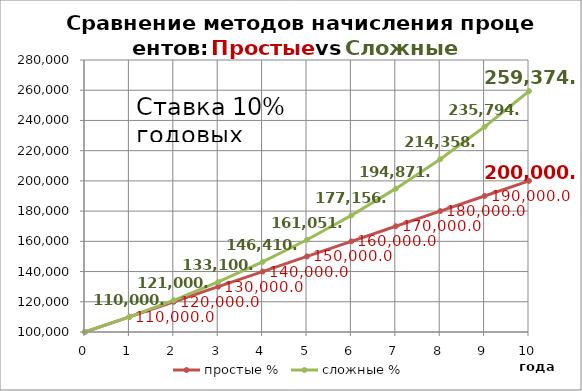
| Category | простые % | сложные % |
|---|---|---|
| 0.0 | 100000 | 100000 |
| 1.0 | 110000 | 110000 |
| 2.0 | 120000 | 121000 |
| 3.0 | 130000 | 133100 |
| 4.0 | 140000 | 146410 |
| 5.0 | 150000 | 161051 |
| 6.0 | 160000 | 177156.1 |
| 7.0 | 170000 | 194871.71 |
| 8.0 | 180000 | 214358.881 |
| 9.0 | 190000 | 235794.769 |
| 10.0 | 200000 | 259374.246 |